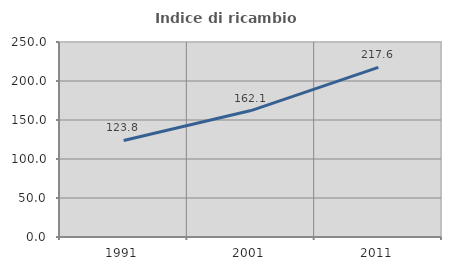
| Category | Indice di ricambio occupazionale  |
|---|---|
| 1991.0 | 123.769 |
| 2001.0 | 162.099 |
| 2011.0 | 217.56 |